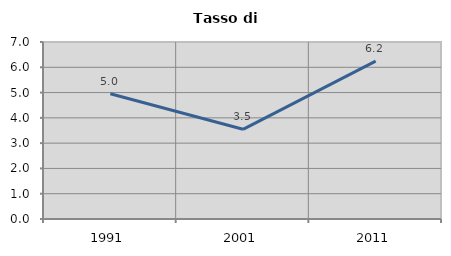
| Category | Tasso di disoccupazione   |
|---|---|
| 1991.0 | 4.952 |
| 2001.0 | 3.548 |
| 2011.0 | 6.241 |